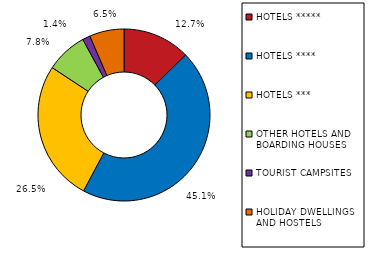
| Category | Series 0 |
|---|---|
| HOTELS ***** | 0.127 |
| HOTELS **** | 0.451 |
| HOTELS *** | 0.265 |
| OTHER HOTELS AND 
BOARDING HOUSES | 0.078 |
| TOURIST CAMPSITES | 0.014 |
| HOLIDAY DWELLINGS 
AND HOSTELS | 0.065 |